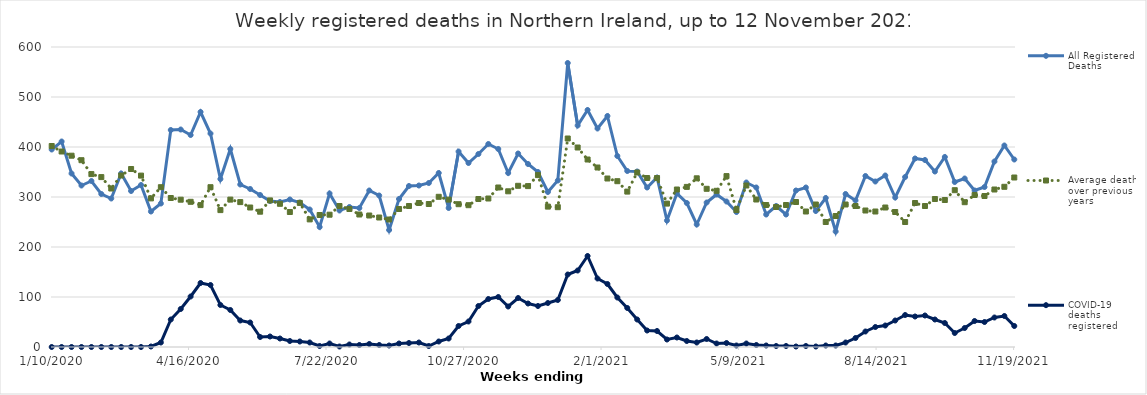
| Category | All Registered Deaths | Average deaths over previous 5 years | COVID-19 deaths registered |
|---|---|---|---|
| 1/10/20 | 395 | 402 | 0 |
| 1/17/20 | 411 | 391 | 0 |
| 1/24/20 | 347 | 382.6 | 0 |
| 1/31/20 | 323 | 373.6 | 0 |
| 2/7/20 | 332 | 345.8 | 0 |
| 2/14/20 | 306 | 339.8 | 0 |
| 2/21/20 | 297 | 317 | 0 |
| 2/28/20 | 347 | 343 | 0 |
| 3/6/20 | 312 | 356 | 0 |
| 3/13/20 | 324 | 342.8 | 0 |
| 3/20/20 | 271 | 297.2 | 1 |
| 3/27/20 | 287 | 319.6 | 9 |
| 4/3/20 | 434 | 298 | 55 |
| 4/10/20 | 435 | 294.6 | 76 |
| 4/17/20 | 424 | 290.4 | 101 |
| 4/24/20 | 470 | 283.8 | 128 |
| 5/1/20 | 427 | 319.6 | 124 |
| 5/8/20 | 336 | 273.8 | 84 |
| 5/15/20 | 396 | 294.8 | 74 |
| 5/22/20 | 325 | 289.8 | 53 |
| 5/29/20 | 316 | 279 | 49 |
| 6/5/20 | 304 | 270.6 | 20 |
| 6/12/20 | 292 | 293.2 | 21 |
| 6/19/20 | 290 | 286.4 | 17 |
| 6/26/20 | 295 | 270 | 12 |
| 7/3/20 | 289 | 288.2 | 11 |
| 7/10/20 | 275 | 255.2 | 9 |
| 7/17/20 | 240 | 264 | 2 |
| 7/24/20 | 307 | 264.6 | 7 |
| 7/31/20 | 273 | 282 | 1 |
| 8/7/20 | 280 | 276 | 5 |
| 8/14/20 | 278 | 265 | 4 |
| 8/21/20 | 313 | 263 | 6 |
| 8/28/20 | 303 | 259 | 4 |
| 9/4/20 | 234 | 255 | 3 |
| 9/11/20 | 296 | 276 | 7 |
| 9/18/20 | 322 | 282 | 8 |
| 9/25/20 | 323 | 288 | 9 |
| 10/2/20 | 328 | 286 | 2 |
| 10/9/20 | 348 | 300.4 | 11 |
| 10/16/20 | 278 | 294.8 | 17 |
| 10/23/20 | 391 | 285.6 | 42 |
| 10/30/20 | 368 | 283.6 | 51 |
| 11/6/20 | 386 | 296 | 82 |
| 11/13/20 | 406 | 297 | 96 |
| 11/20/20 | 396 | 319 | 100 |
| 11/27/20 | 348 | 311.4 | 81 |
| 12/4/20 | 387 | 322.4 | 98 |
| 12/11/20 | 366 | 321.8 | 87 |
| 12/18/20 | 350 | 343.8 | 82 |
| 12/25/20 | 310 | 280.8 | 88 |
| 1/1/21 | 333 | 279.6 | 94 |
| 1/8/21 | 568 | 417 | 145 |
| 1/15/21 | 443 | 399 | 153 |
| 1/22/21 | 474 | 375 | 182 |
| 1/29/21 | 437 | 359 | 137 |
| 2/5/21 | 462 | 337 | 126 |
| 2/12/21 | 382 | 331.6 | 99 |
| 2/19/21 | 352 | 310.8 | 78 |
| 2/26/21 | 351 | 349 | 55 |
| 3/5/21 | 319 | 338 | 33 |
| 3/12/21 | 339 | 338 | 32 |
| 3/19/21 | 253 | 286.8 | 15 |
| 3/26/21 | 307 | 315 | 19 |
| 4/2/21 | 288 | 320.2 | 12 |
| 4/9/21 | 245 | 337.4 | 9 |
| 4/16/21 | 289 | 316.4 | 16 |
| 4/23/21 | 305 | 312.4 | 7 |
| 4/30/21 | 291 | 341.8 | 8 |
| 5/7/21 | 270 | 274 | 3 |
| 5/14/21 | 329 | 323 | 7 |
| 5/21/21 | 319 | 295 | 4 |
| 5/28/21 | 265 | 284 | 3 |
| 6/4/21 | 282 | 280 | 2 |
| 6/11/21 | 265 | 284 | 2 |
| 6/18/21 | 313 | 290 | 1 |
| 6/25/21 | 319 | 271 | 2 |
| 7/2/21 | 272 | 285 | 1 |
| 7/9/21 | 298 | 250 | 3 |
| 7/16/21 | 231 | 262 | 3 |
| 7/23/21 | 306 | 285 | 9 |
| 7/30/21 | 293 | 282 | 18 |
| 8/6/21 | 342 | 273 | 31 |
| 8/13/21 | 331 | 271 | 40 |
| 8/20/21 | 343 | 279 | 43 |
| 8/27/21 | 299 | 270 | 53 |
| 9/3/21 | 340 | 250 | 64 |
| 9/10/21 | 377 | 288 | 61 |
| 9/17/21 | 374 | 282 | 63 |
| 9/24/21 | 351 | 296 | 55 |
| 10/1/21 | 380 | 294 | 48 |
| 10/8/21 | 330 | 313.6 | 28 |
| 10/15/21 | 337 | 289.6 | 38 |
| 10/22/21 | 313 | 304 | 52 |
| 10/29/21 | 320 | 302 | 50 |
| 11/5/21 | 371 | 315 | 59 |
| 11/12/21 | 403 | 320.4 | 62 |
| 11/19/21 | 375 | 339 | 42 |